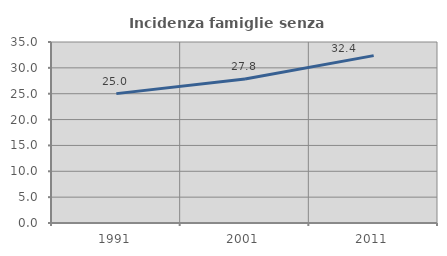
| Category | Incidenza famiglie senza nuclei |
|---|---|
| 1991.0 | 25.016 |
| 2001.0 | 27.827 |
| 2011.0 | 32.365 |